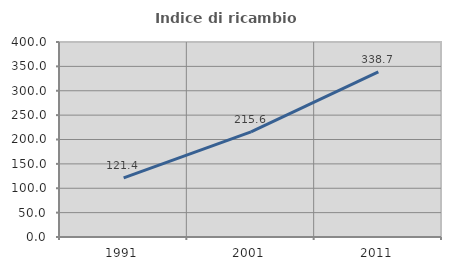
| Category | Indice di ricambio occupazionale  |
|---|---|
| 1991.0 | 121.429 |
| 2001.0 | 215.556 |
| 2011.0 | 338.679 |